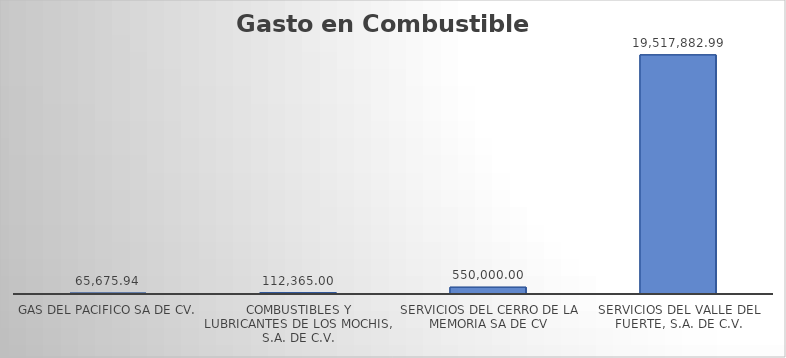
| Category | Suma |
|---|---|
| GAS DEL PACIFICO SA DE CV. | 65675.94 |
| COMBUSTIBLES Y LUBRICANTES DE LOS MOCHIS, S.A. DE C.V. | 112365 |
| SERVICIOS DEL CERRO DE LA MEMORIA SA DE CV | 550000 |
| SERVICIOS DEL VALLE DEL FUERTE, S.A. DE C.V. | 19517882.99 |